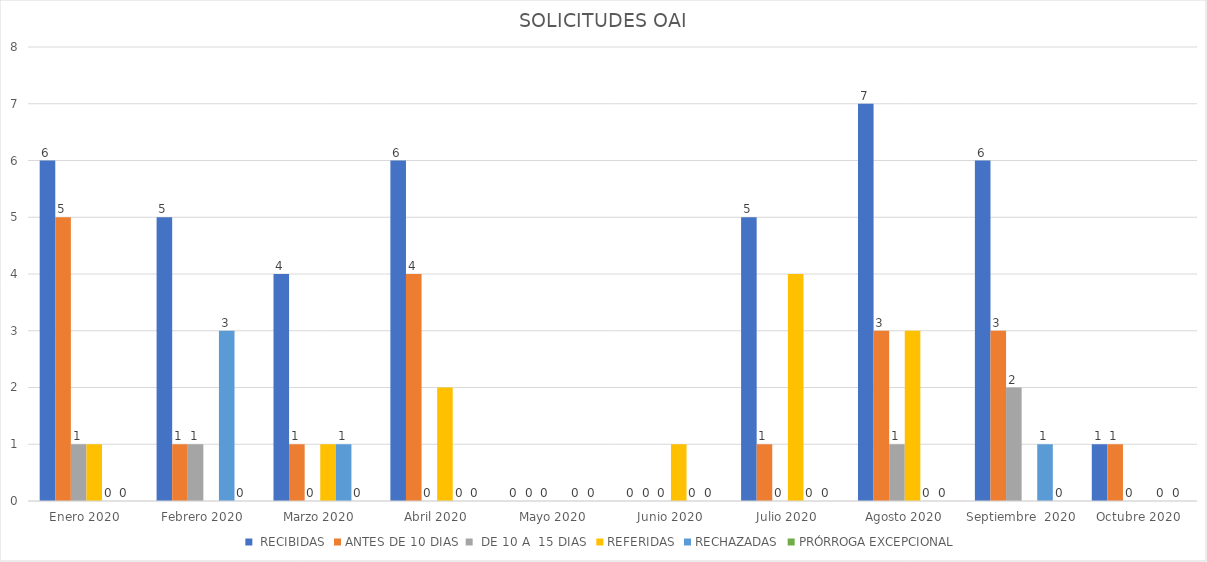
| Category |  RECIBIDAS | ANTES DE 10 DIAS |  DE 10 A  15 DIAS  | REFERIDAS | RECHAZADAS | PRÓRROGA EXCEPCIONAL |
|---|---|---|---|---|---|---|
| Enero 2020 | 6 | 5 | 1 | 1 | 0 | 0 |
| Febrero 2020 | 5 | 1 | 1 | 0 | 3 | 0 |
| Marzo 2020 | 4 | 1 | 0 | 1 | 1 | 0 |
| Abril 2020 | 6 | 4 | 0 | 2 | 0 | 0 |
| Mayo 2020 | 0 | 0 | 0 | 0 | 0 | 0 |
| Junio 2020 | 0 | 0 | 0 | 1 | 0 | 0 |
| Julio 2020 | 5 | 1 | 0 | 4 | 0 | 0 |
| Agosto 2020 | 7 | 3 | 1 | 3 | 0 | 0 |
| Septiembre  2020 | 6 | 3 | 2 | 0 | 1 | 0 |
| Octubre 2020 | 1 | 1 | 0 | 0 | 0 | 0 |